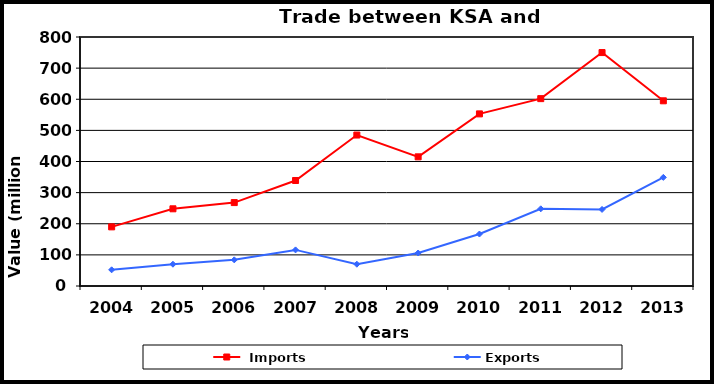
| Category |  Imports | Exports |
|---|---|---|
| 2004.0 | 190 | 52 |
| 2005.0 | 248 | 70 |
| 2006.0 | 268 | 84 |
| 2007.0 | 339 | 116 |
| 2008.0 | 485 | 70 |
| 2009.0 | 415 | 106 |
| 2010.0 | 553 | 167 |
| 2011.0 | 602 | 248 |
| 2012.0 | 750 | 246 |
| 2013.0 | 595 | 349 |